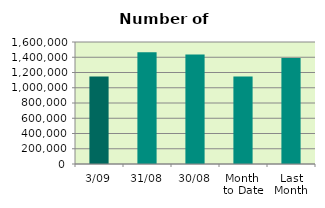
| Category | Series 0 |
|---|---|
| 3/09 | 1147782 |
| 31/08 | 1467024 |
| 30/08 | 1435586 |
| Month 
to Date | 1147782 |
| Last
Month | 1391040.957 |